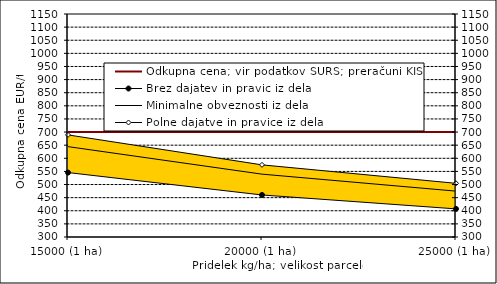
| Category | Odkupna cena; vir podatkov SURS; preračuni KIS |
|---|---|
| 15000 (1 ha) | 700 |
| 20000 (1 ha) | 700 |
| 25000 (1 ha) | 700 |